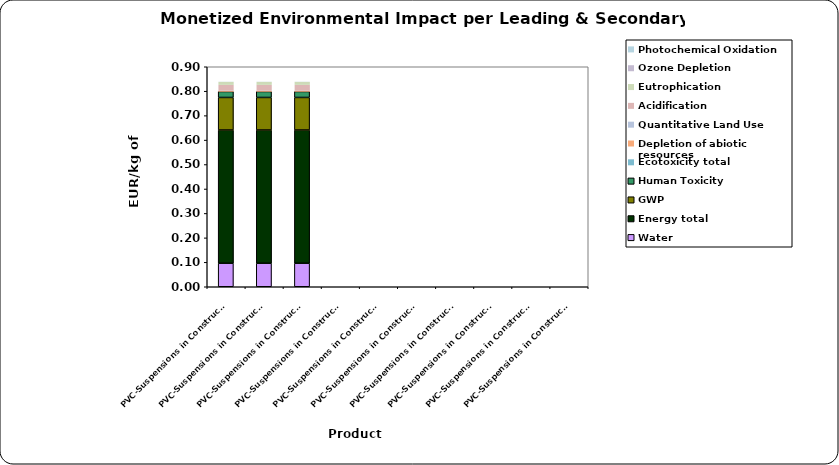
| Category | Water | Energy total | GWP | Human Toxicity | Ecotoxicity total | Depletion of abiotic resources | Quantitative Land Use | Acidification | Eutrophication | Ozone Depletion | Photochemical Oxidation |
|---|---|---|---|---|---|---|---|---|---|---|---|
| PVC-Suspensions in Construction in Window profile | 0.096 | 0.545 | 0.133 | 0.024 | 0 | 0.004 | 0 | 0.024 | 0.012 | 0 | 0.001 |
| PVC-Suspensions in Construction in Fresh water conveying pipe | 0.096 | 0.545 | 0.133 | 0.024 | 0 | 0.004 | 0 | 0.024 | 0.012 | 0 | 0.001 |
| PVC-Suspensions in Construction in Sewage pipe | 0.096 | 0.545 | 0.133 | 0.024 | 0 | 0.004 | 0 | 0.024 | 0.012 | 0 | 0.001 |
| PVC-Suspensions in Construction in application 4 | 0 | 0 | 0 | 0 | 0 | 0 | 0 | 0 | 0 | 0 | 0 |
| PVC-Suspensions in Construction in application 5 | 0 | 0 | 0 | 0 | 0 | 0 | 0 | 0 | 0 | 0 | 0 |
| PVC-Suspensions in Construction in application 6 | 0 | 0 | 0 | 0 | 0 | 0 | 0 | 0 | 0 | 0 | 0 |
| PVC-Suspensions in Construction in application 7 | 0 | 0 | 0 | 0 | 0 | 0 | 0 | 0 | 0 | 0 | 0 |
| PVC-Suspensions in Construction in application 8 | 0 | 0 | 0 | 0 | 0 | 0 | 0 | 0 | 0 | 0 | 0 |
| PVC-Suspensions in Construction in application 9 | 0 | 0 | 0 | 0 | 0 | 0 | 0 | 0 | 0 | 0 | 0 |
| PVC-Suspensions in Construction in application 10 | 0 | 0 | 0 | 0 | 0 | 0 | 0 | 0 | 0 | 0 | 0 |